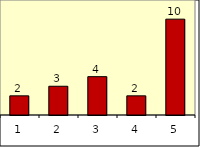
| Category | Series 1 |
|---|---|
| 0 | 2 |
| 1 | 3 |
| 2 | 4 |
| 3 | 2 |
| 4 | 10 |